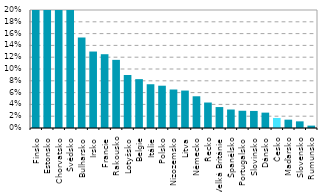
| Category | Series 0 |
|---|---|
| Finsko | 0.357 |
| Estonsko | 0.351 |
| Chorvatsko | 0.3 |
| Švédsko | 0.29 |
| Bulharsko | 0.154 |
| Irsko | 0.13 |
| Francie | 0.125 |
| Rakousko | 0.116 |
| Lotyšsko | 0.09 |
| Belgie | 0.083 |
| Itálie | 0.074 |
| Polsko | 0.072 |
| Nizozemsko | 0.065 |
| Litva | 0.063 |
| Německo | 0.054 |
| Řecko | 0.043 |
| Velká Británie | 0.035 |
| Španělsko | 0.031 |
| Portugalsko | 0.029 |
| Slovinsko | 0.029 |
| Dánsko | 0.026 |
| Česko | 0.017 |
| Maďarsko | 0.014 |
| Slovensko | 0.011 |
| Rumunsko | 0.004 |